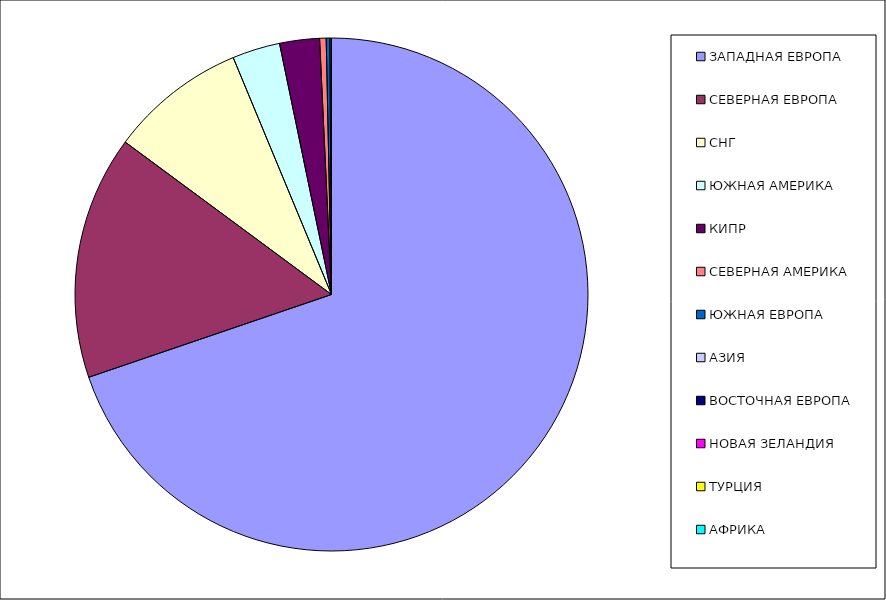
| Category | Оборот |
|---|---|
| ЗАПАДНАЯ ЕВРОПА | 0.698 |
| СЕВЕРНАЯ ЕВРОПА | 0.154 |
| СНГ | 0.086 |
| ЮЖНАЯ АМЕРИКА | 0.03 |
| КИПР | 0.025 |
| СЕВЕРНАЯ АМЕРИКА | 0.004 |
| ЮЖНАЯ ЕВРОПА | 0.002 |
| АЗИЯ | 0.001 |
| ВОСТОЧНАЯ ЕВРОПА | 0 |
| НОВАЯ ЗЕЛАНДИЯ | 0 |
| ТУРЦИЯ | 0 |
| АФРИКА | 0 |